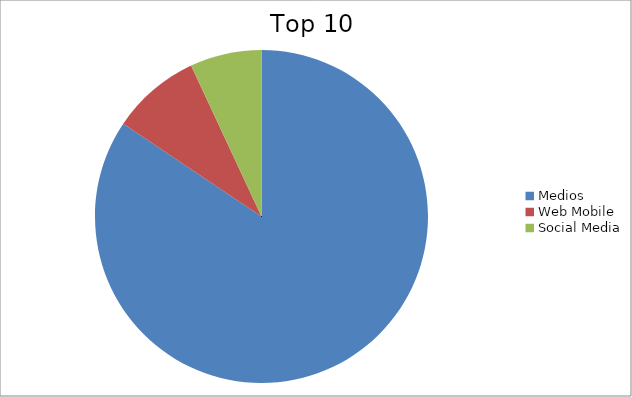
| Category | Series 0 |
|---|---|
| Medios | 84.41 |
| Web Mobile | 8.65 |
| Social Media | 6.95 |